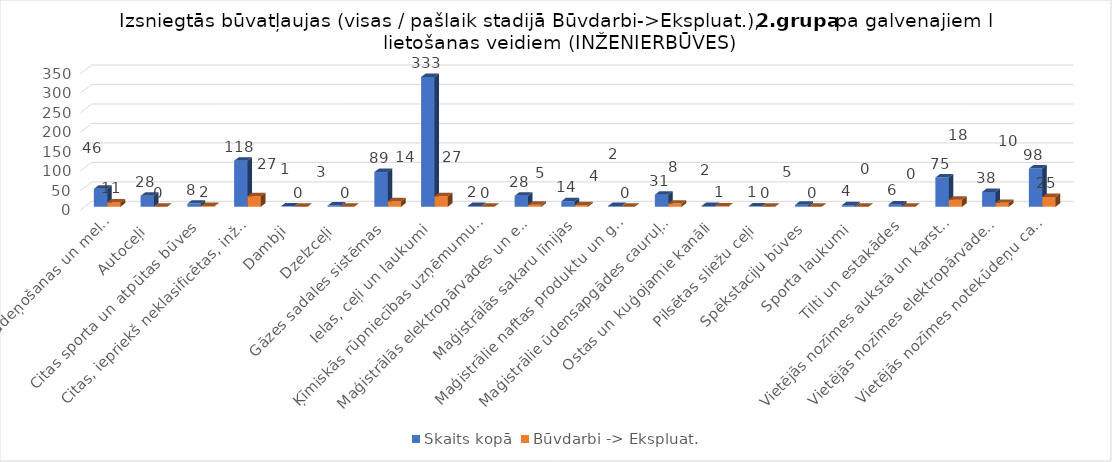
| Category | Skaits kopā | Būvdarbi -> Ekspluat. |
|---|---|---|
| Akvedukti, apūdeņošanas un meliorācijas hidrobūves | 46 | 11 |
| Autoceļi | 28 | 0 |
| Citas sporta un atpūtas būves | 8 | 2 |
| Citas, iepriekš neklasificētas, inženierbūves | 118 | 27 |
| Dambji | 1 | 0 |
| Dzelzceļi | 3 | 0 |
| Gāzes sadales sistēmas | 89 | 14 |
| Ielas, ceļi un laukumi | 333 | 27 |
| Ķīmiskās rūpniecības uzņēmumu būves | 2 | 0 |
| Maģistrālās elektropārvades un elektrosadales līnijas | 28 | 5 |
| Maģistrālās sakaru līnijas | 14 | 4 |
| Maģistrālie naftas produktu un gāzes cauruļvadi | 2 | 0 |
| Maģistrālie ūdensapgādes cauruļvadi | 31 | 8 |
| Ostas un kuģojamie kanāli | 2 | 1 |
| Pilsētas sliežu ceļi | 1 | 0 |
| Spēkstaciju būves | 5 | 0 |
| Sporta laukumi | 4 | 0 |
| Tilti un estakādes | 6 | 0 |
| Vietējās nozīmes aukstā un karstā ūdens apgādes būves | 75 | 18 |
| Vietējās nozīmes elektropārvades un sakaru kabeļu būves | 38 | 10 |
| Vietējās nozīmes notekūdeņu cauruļvadi un attīrīšanas būves | 98 | 25 |